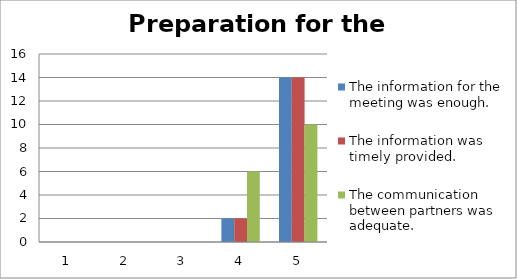
| Category | The information for the meeting was enough. | The information was timely provided. | The communication between partners was adequate. |
|---|---|---|---|
| 0 | 0 | 0 | 0 |
| 1 | 0 | 0 | 0 |
| 2 | 0 | 0 | 0 |
| 3 | 2 | 2 | 6 |
| 4 | 14 | 14 | 10 |